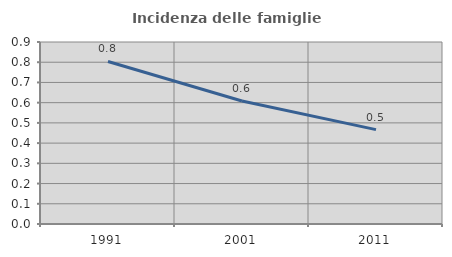
| Category | Incidenza delle famiglie numerose |
|---|---|
| 1991.0 | 0.804 |
| 2001.0 | 0.608 |
| 2011.0 | 0.467 |